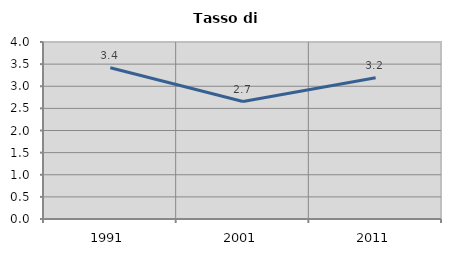
| Category | Tasso di disoccupazione   |
|---|---|
| 1991.0 | 3.419 |
| 2001.0 | 2.655 |
| 2011.0 | 3.191 |